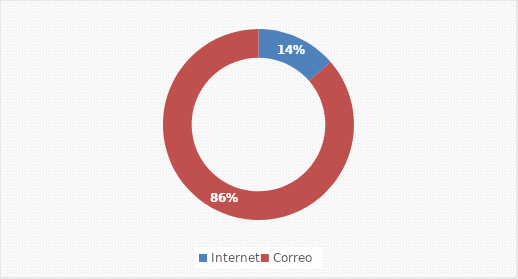
| Category | Series 0 |
|---|---|
| Internet | 9 |
| Correo | 57 |